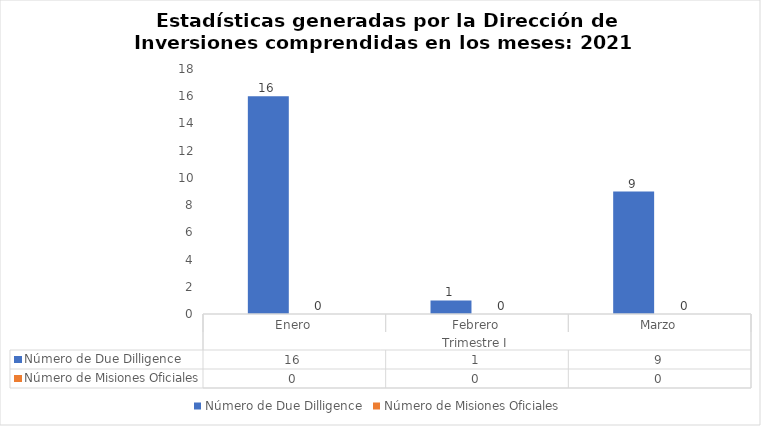
| Category | Número de Due Dilligence | Número de Misiones Oficiales |
|---|---|---|
| 0 | 16 | 0 |
| 1 | 1 | 0 |
| 2 | 9 | 0 |